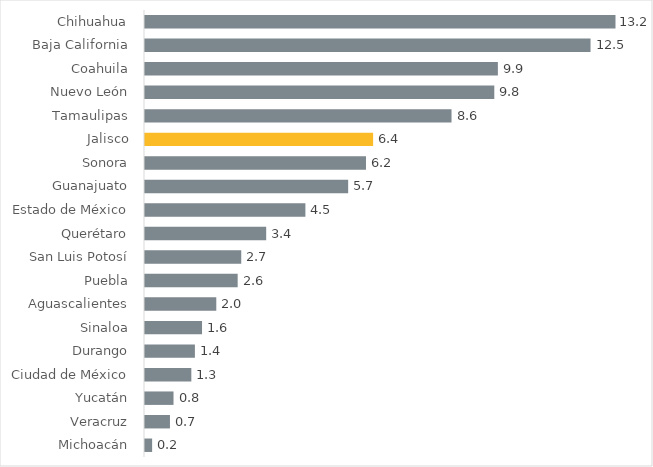
| Category | Series 0 |
|---|---|
| Michoacán | 0.2 |
| Veracruz | 0.7 |
| Yucatán | 0.8 |
| Ciudad de México | 1.3 |
| Durango | 1.4 |
| Sinaloa | 1.6 |
| Aguascalientes | 2 |
| Puebla | 2.6 |
| San Luis Potosí | 2.7 |
| Querétaro | 3.4 |
| Estado de México | 4.5 |
| Guanajuato | 5.7 |
| Sonora | 6.2 |
| Jalisco | 6.4 |
| Tamaulipas | 8.6 |
| Nuevo León | 9.8 |
| Coahuila | 9.9 |
| Baja California | 12.5 |
| Chihuahua | 13.2 |